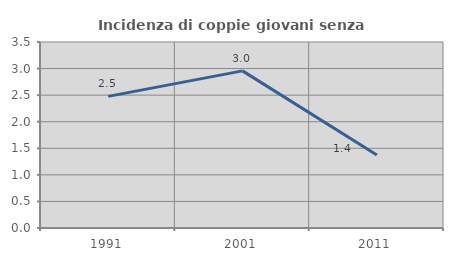
| Category | Incidenza di coppie giovani senza figli |
|---|---|
| 1991.0 | 2.477 |
| 2001.0 | 2.957 |
| 2011.0 | 1.372 |